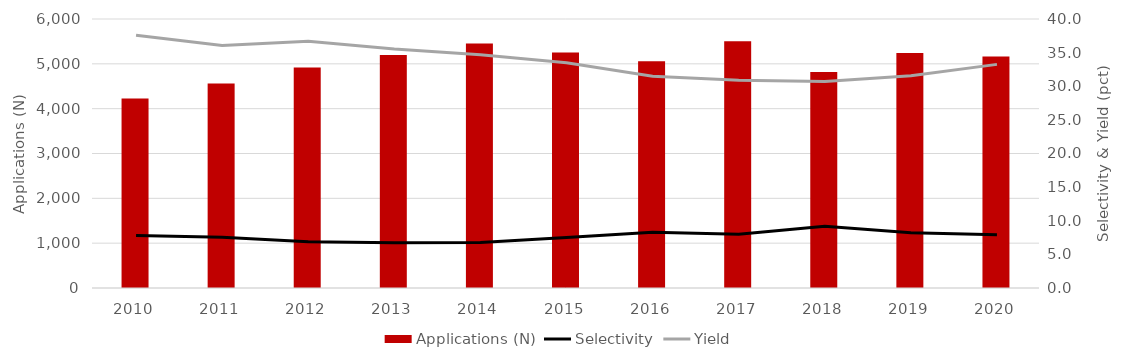
| Category | Applications (N) |
|---|---|
| 2010 | 4226 |
| 2011 | 4564 |
| 2012 | 4918 |
| 2013 | 5196 |
| 2014 | 5454 |
| 2015 | 5255 |
| 2016 | 5057 |
| 2017 | 5505 |
| 2018 | 4816 |
| 2019 | 5241 |
| 2020 | 5164 |